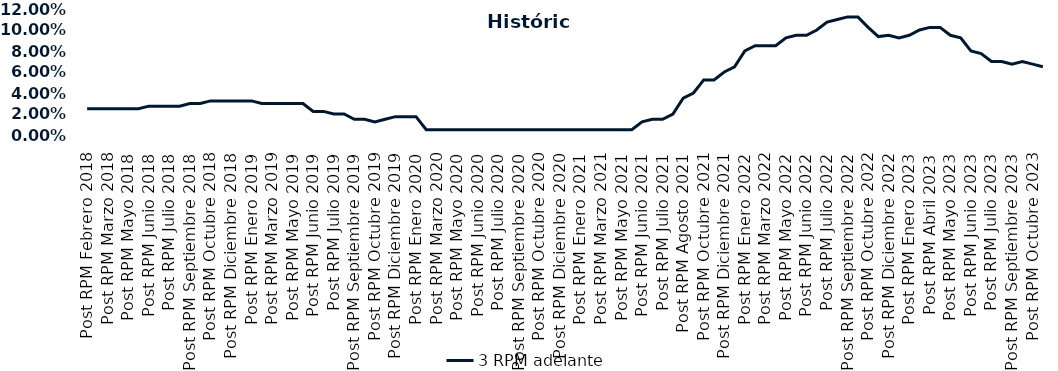
| Category | 3 RPM adelante |
|---|---|
| Post RPM Febrero 2018 | 0.025 |
| Pre RPM Marzo 2018 | 0.025 |
| Post RPM Marzo 2018 | 0.025 |
| Pre RPM Mayo 2018 | 0.025 |
| Post RPM Mayo 2018 | 0.025 |
| Pre RPM Junio 2018 | 0.025 |
| Post RPM Junio 2018 | 0.028 |
| Pre RPM Julio 2018 | 0.028 |
| Post RPM Julio 2018 | 0.028 |
| Pre RPM Septiembre 2018 | 0.028 |
| Post RPM Septiembre 2018 | 0.03 |
| Pre RPM Octubre 2018 | 0.03 |
| Post RPM Octubre 2018 | 0.032 |
| Pre RPM Diciembre 2018 | 0.032 |
| Post RPM Diciembre 2018 | 0.032 |
| Pre RPM Enero 2019 | 0.032 |
| Post RPM Enero 2019 | 0.032 |
| Pre RPM Marzo 2019 | 0.03 |
| Post RPM Marzo 2019 | 0.03 |
| Pre RPM Mayo 2019 | 0.03 |
| Post RPM Mayo 2019 | 0.03 |
| Pre RPM Junio 2019 | 0.03 |
| Post RPM Junio 2019 | 0.022 |
| Pre RPM Julio 2019 | 0.022 |
| Post RPM Julio 2019 | 0.02 |
| Pre RPM Septiembre 2019 | 0.02 |
| Post RPM Septiembre 2019 | 0.015 |
| Pre RPM Octubre 2019 | 0.015 |
| Post RPM Octubre 2019 | 0.012 |
| Pre RPM Diciembre 2019 | 0.015 |
| Post RPM Diciembre 2019 | 0.018 |
| Pre RPM Enero 2020 | 0.018 |
| Post RPM Enero 2020 | 0.018 |
| Pre RPM Marzo 2020 | 0.005 |
| Post RPM Marzo 2020 | 0.005 |
| Pre RPM Mayo 2020 | 0.005 |
| Post RPM Mayo 2020 | 0.005 |
| Pre RPM Junio 2020 | 0.005 |
| Post RPM Junio 2020 | 0.005 |
| Pre RPM Julio 2020 | 0.005 |
| Post RPM Julio 2020 | 0.005 |
| Pre RPM Septiembre 2020 | 0.005 |
| Post RPM Septiembre 2020 | 0.005 |
| Pre RPM Octubre 2020 | 0.005 |
| Post RPM Octubre 2020 | 0.005 |
| Pre RPM Diciembre 2020 | 0.005 |
| Post RPM Diciembre 2020 | 0.005 |
| Pre RPM Enero 2021 | 0.005 |
| Post RPM Enero 2021 | 0.005 |
| Pre RPM Marzo 2021 | 0.005 |
| Post RPM Marzo 2021 | 0.005 |
| Pre RPM Mayo 2021 | 0.005 |
| Post RPM Mayo 2021 | 0.005 |
| Pre RPM Junio 2021 | 0.005 |
| Post RPM Junio 2021 | 0.012 |
| Pre RPM Julio 2021 | 0.015 |
| Post RPM Julio 2021 | 0.015 |
| Pre RPM Agosto 2021 | 0.02 |
| Post RPM Agosto 2021 | 0.035 |
| Pre RPM Octubre 2021 | 0.04 |
| Post RPM Octubre 2021 | 0.052 |
| Pre RPM Diciembre 2021 | 0.052 |
| Post RPM Diciembre 2021 | 0.06 |
| Pre RPM Enero 2022 | 0.065 |
| Post RPM Enero 2022 | 0.08 |
| Pre RPM Marzo 2022 | 0.085 |
| Post RPM Marzo 2022 | 0.085 |
| Pre RPM Mayo 2022 | 0.085 |
| Post RPM Mayo 2022 | 0.092 |
| Pre RPM Junio 2022 | 0.095 |
| Post RPM Junio 2022 | 0.095 |
| Pre RPM Julio 2022 | 0.1 |
| Post RPM Julio 2022 | 0.108 |
| Pre RPM Septiembre 2022 | 0.11 |
| Post RPM Septiembre 2022 | 0.112 |
| Pre RPM Octubre 2022 | 0.112 |
| Post RPM Octubre 2022 | 0.102 |
| Pre RPM Diciembre 2022 | 0.094 |
| Post RPM Diciembre 2022 | 0.095 |
| Pre RPM Enero 2023 | 0.092 |
| Post RPM Enero 2023 | 0.095 |
| Pre RPM Abril 2023 | 0.1 |
| Post RPM Abril 2023 | 0.102 |
| Pre RPM Mayo 2023 | 0.102 |
| Post RPM Mayo 2023 | 0.095 |
| Pre RPM Junio 2023 | 0.092 |
| Post RPM Junio 2023 | 0.08 |
| Pre RPM Julio 2023 | 0.078 |
| Post RPM Julio 2023 | 0.07 |
| Pre RPM Septiembre 2023 | 0.07 |
| Post RPM Septiembre 2023 | 0.068 |
| Pre RPM Octubre 2023 | 0.07 |
| Post RPM Octubre 2023 | 0.068 |
| Pre RPM Diciembre 2023 | 0.065 |